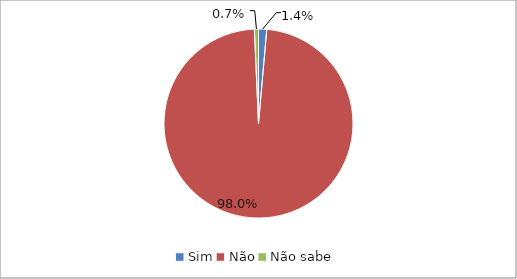
| Category | Series 0 |
|---|---|
| Sim | 0.014 |
| Não | 0.98 |
| Não sabe | 0.007 |